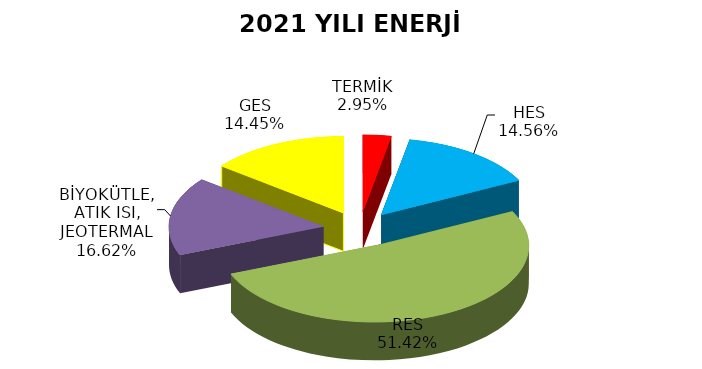
| Category | Series 0 |
|---|---|
| TERMİK | 101.8 |
| HES | 501.826 |
| RES | 1772.13 |
| BİYOKÜTLE, ATIK ISI, JEOTERMAL | 572.635 |
| GES | 498.05 |